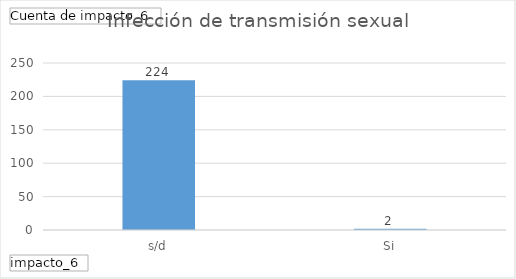
| Category | Total |
|---|---|
| s/d | 224 |
| Si | 2 |